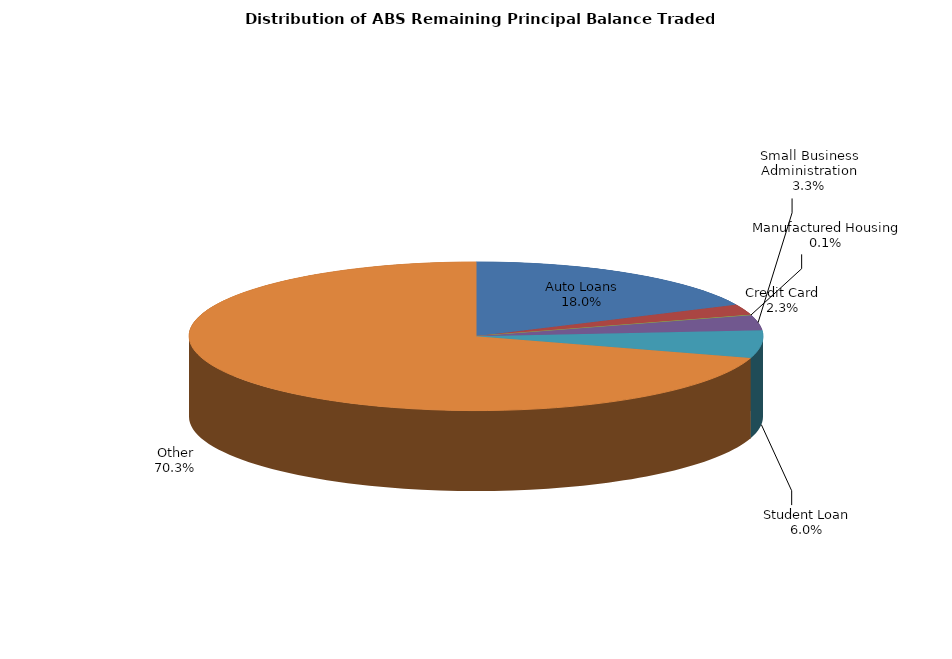
| Category | Series 0 |
|---|---|
| Auto Loans | 435168987.84 |
| Credit Card | 56538494.802 |
| Manufactured Housing | 1615052.37 |
| Small Business Administration | 79145820.769 |
| Student Loan | 146179535.112 |
| Other | 1698441599.471 |